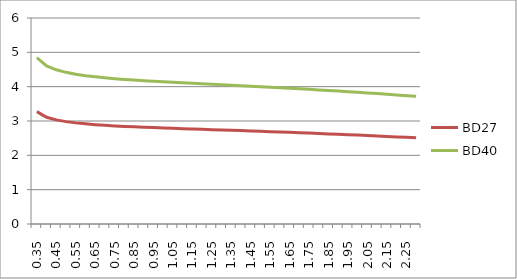
| Category | BD27 | BD40 |
|---|---|---|
| 0.35 | 3.273 | 4.848 |
| 0.39999999999999997 | 3.109 | 4.606 |
| 0.44999999999999996 | 3.032 | 4.491 |
| 0.49999999999999994 | 2.982 | 4.417 |
| 0.5499999999999999 | 2.945 | 4.363 |
| 0.6 | 2.917 | 4.321 |
| 0.65 | 2.893 | 4.286 |
| 0.7000000000000001 | 2.874 | 4.258 |
| 0.7500000000000001 | 2.858 | 4.233 |
| 0.8000000000000002 | 2.843 | 4.212 |
| 0.8500000000000002 | 2.83 | 4.193 |
| 0.9000000000000002 | 2.818 | 4.175 |
| 0.9500000000000003 | 2.807 | 4.159 |
| 1.0000000000000002 | 2.797 | 4.143 |
| 1.0500000000000003 | 2.787 | 4.128 |
| 1.1000000000000003 | 2.777 | 4.114 |
| 1.1500000000000004 | 2.768 | 4.1 |
| 1.2000000000000004 | 2.758 | 4.086 |
| 1.2500000000000004 | 2.749 | 4.072 |
| 1.3000000000000005 | 2.739 | 4.058 |
| 1.3500000000000005 | 2.73 | 4.043 |
| 1.4000000000000006 | 2.72 | 4.029 |
| 1.4500000000000006 | 2.71 | 4.015 |
| 1.5000000000000007 | 2.7 | 4 |
| 1.5500000000000007 | 2.69 | 3.985 |
| 1.6000000000000008 | 2.68 | 3.97 |
| 1.6500000000000008 | 2.669 | 3.954 |
| 1.7000000000000008 | 2.659 | 3.938 |
| 1.7500000000000009 | 2.648 | 3.922 |
| 1.800000000000001 | 2.636 | 3.905 |
| 1.850000000000001 | 2.625 | 3.888 |
| 1.900000000000001 | 2.613 | 3.871 |
| 1.950000000000001 | 2.601 | 3.853 |
| 2.000000000000001 | 2.589 | 3.835 |
| 2.0500000000000007 | 2.576 | 3.817 |
| 2.1000000000000005 | 2.564 | 3.798 |
| 2.1500000000000004 | 2.551 | 3.778 |
| 2.2 | 2.537 | 3.758 |
| 2.25 | 2.524 | 3.738 |
| 2.3 | 2.51 | 3.718 |